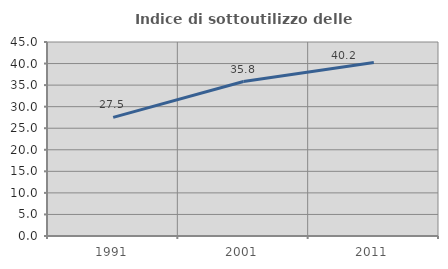
| Category | Indice di sottoutilizzo delle abitazioni  |
|---|---|
| 1991.0 | 27.521 |
| 2001.0 | 35.826 |
| 2011.0 | 40.222 |